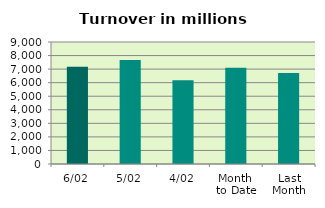
| Category | Series 0 |
|---|---|
| 6/02 | 7179.957 |
| 5/02 | 7674.631 |
| 4/02 | 6170.165 |
| Month 
to Date | 7103.708 |
| Last
Month | 6707.699 |